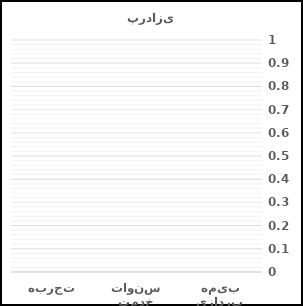
| Category | Series 0 | Series 1 |
|---|---|---|
| بیمه پردازی |  | 0 |
| سنوات خدمت |  | 0 |
| تجربه |  | 0 |